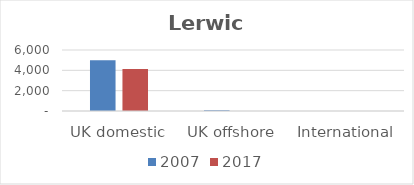
| Category | 2007 | 2017 |
|---|---|---|
| UK domestic | 4984 | 4139 |
| UK offshore | 75 | 0 |
| International | 0 | 0 |